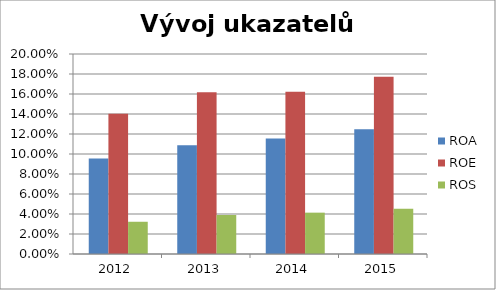
| Category | ROA | ROE | ROS |
|---|---|---|---|
| 2015.0 | 0.125 | 0.177 | 0.045 |
| 2014.0 | 0.116 | 0.162 | 0.041 |
| 2013.0 | 0.109 | 0.162 | 0.039 |
| 2012.0 | 0.095 | 0.14 | 0.032 |